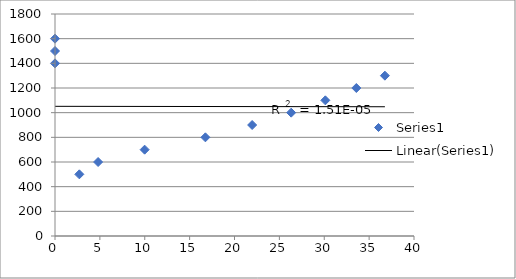
| Category | Series 0 |
|---|---|
| 2.71183497654149 | 500 |
| 4.80203025547779 | 600 |
| 9.98883746146222 | 700 |
| 16.7580994663971 | 800 |
| 21.9664945443329 | 900 |
| 26.3149480119546 | 1000 |
| 30.1211920413055 | 1100 |
| 33.5750244793057 | 1200 |
| 36.7567505911413 | 1300 |
| nan | 1400 |
| nan | 1500 |
| nan | 1600 |